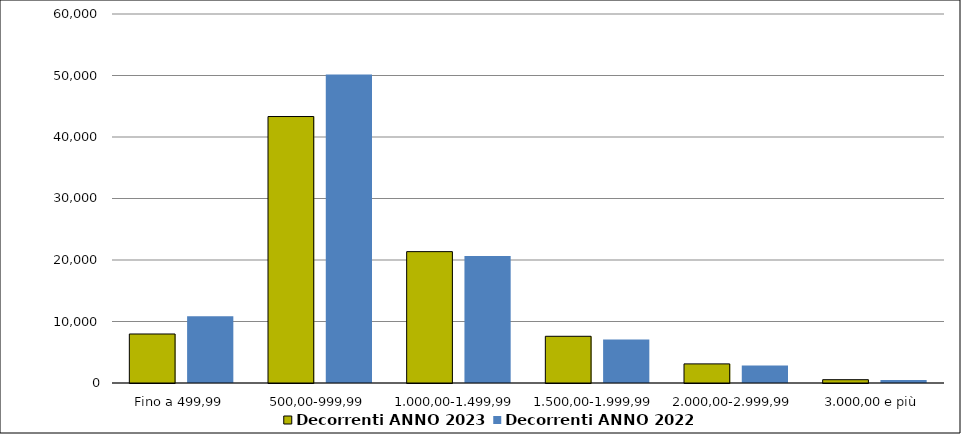
| Category | Decorrenti ANNO 2023 | Decorrenti ANNO 2022 |
|---|---|---|
|  Fino a 499,99  | 7968 | 10858 |
|  500,00-999,99  | 43330 | 50171 |
|  1.000,00-1.499,99  | 21360 | 20667 |
|  1.500,00-1.999,99  | 7596 | 7081 |
|  2.000,00-2.999,99  | 3108 | 2856 |
|  3.000,00 e più  | 538 | 508 |